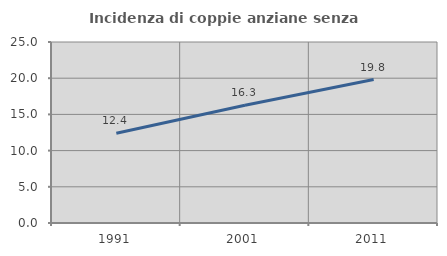
| Category | Incidenza di coppie anziane senza figli  |
|---|---|
| 1991.0 | 12.384 |
| 2001.0 | 16.254 |
| 2011.0 | 19.816 |